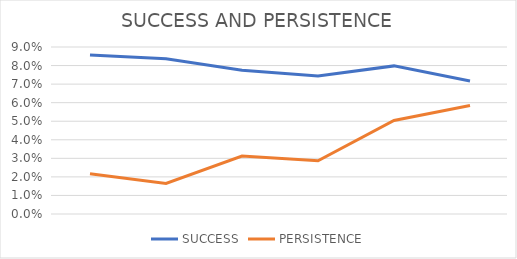
| Category | SUCCESS | PERSISTENCE |
|---|---|---|
| 0 | 0.086 | 0.022 |
| 1 | 0.084 | 0.017 |
| 2 | 0.077 | 0.031 |
| 3 | 0.074 | 0.029 |
| 4 | 0.08 | 0.05 |
| 5 | 0.072 | 0.059 |